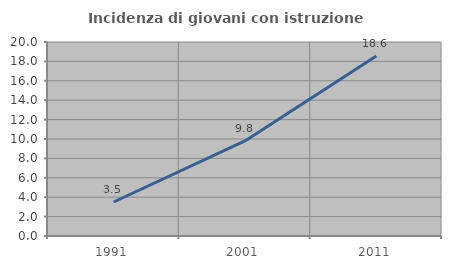
| Category | Incidenza di giovani con istruzione universitaria |
|---|---|
| 1991.0 | 3.504 |
| 2001.0 | 9.803 |
| 2011.0 | 18.568 |